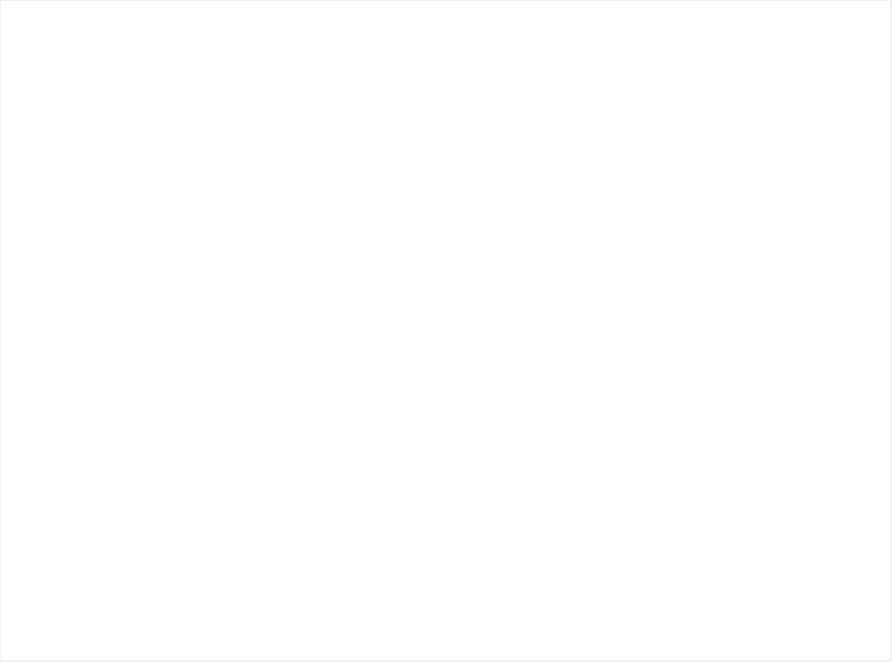
| Category | # of People adopt basic personal and community hygiene practices | # of people access to functioning  sanitation facilities | # of people Equitable and continuous access to sufficient quantity of domestic water |
|---|---|---|---|
| 0 | 4717 | 4129 | 1284.837 |
| 1 | 4836 | 4629 | 4836 |
| 2 | 4859 | 4859 | 4859 |
| 3 | 1895 | 2111 | 2111 |
| 4 | 1910 | 2111 | 2111 |
| 5 | 2111 | 2111 | 2111 |
| 6 | 4892 | 4130 | 4892 |
| 7 | 4892 | 4892 | 4892 |
| 8 | 4892 | 4892 | 4892 |
| 9 | 6936 | 5830 | 6936 |
| 10 | 6615 | 5060 | 6936 |
| 11 | 6936 | 4760 | 6936 |
| 12 | 11625 | 8160 | 11625 |
| 13 | 9245 | 8770 | 11625 |
| 14 | 11625 | 7910 | 11625 |
| 15 | 3360 | 0 | 3360 |
| 16 | 2990 | 500 | 3360 |
| 17 | 3360 | 500 | 3360 |
| 18 | 979 | 979 | 979 |
| 19 | 974 | 974 | 974 |
| 20 | 971 | 971 | 971 |
| 21 | 6042 | 3930 | 6042 |
| 22 | 6037 | 3370 | 6037 |
| 23 | 6042 | 3930 | 6042 |
| 24 | 3486 | 3486 | 3486 |
| 25 | 0 | 3486 | 3486 |
| 26 | 3486 | 3486 | 3486 |
| 27 | 4645 | 2074 | 4645 |
| 28 | 4671 | 3134 | 4671 |
| 29 | 4671 | 3114 | 4671 |
| 30 | 4104 | 3023 | 2717.656 |
| 31 | 4676 | 3483 | 4676 |
| 32 | 4676 | 3823 | 4676 |
| 33 | 0 | 581 | 581 |
| 34 | 0 | 581 | 0 |
| 35 | 0 | 581 | 0 |
| 36 | 3095 | 3095 | 3095 |
| 37 | 3095 | 3095 | 3095 |
| 38 | 3095 | 3095 | 3095 |
| 39 | 13302 | 8870 | 13302 |
| 40 | 13302 | 10090 | 13302 |
| 41 | 13302 | 10530 | 13302 |
| 42 | 11487 | 6816 | 11487 |
| 43 | 11396 | 11396 | 11396 |
| 44 | 11487 | 8531 | 11487 |
| 45 | 11564 | 11564 | 11564 |
| 46 | 11564 | 11564 | 11564 |
| 47 | 11564 | 11564 | 11564 |
| 48 | 2805 | 2805 | 2805 |
| 49 | 2805 | 2805 | 2805 |
| 50 | 0 | 2805 | 2805 |
| 51 | 2920 | 2920 | 2920 |
| 52 | 2920 | 2920 | 2920 |
| 53 | 2920 | 2920 | 2920 |
| 54 | 6016 | 4020 | 6016 |
| 55 | 5580 | 3910 | 6016 |
| 56 | 6016 | 3770 | 6016 |
| 57 | 5950 | 5030 | 5950 |
| 58 | 5950 | 5210 | 5950 |
| 59 | 5950 | 5890 | 5950 |
| 60 | 1670 | 800 | 1670 |
| 61 | 1670 | 0 | 1670 |
| 62 | 1670 | 0 | 1670 |
| 63 | 2186 | 1710 | 2186 |
| 64 | 2186 | 2186 | 2186 |
| 65 | 2186 | 2186 | 2186 |
| 66 | 2248 | 2200 | 2248 |
| 67 | 2248 | 2130 | 2248 |
| 68 | 2248 | 2248 | 2248 |
| 69 | 2285 | 2285 | 2285 |
| 70 | 2285 | 2285 | 2285 |
| 71 | 2285 | 2285 | 2285 |
| 72 | 114 | 100 | 114 |
| 73 | 114 | 0 | 0 |
| 74 | 114 | 0 | 0 |